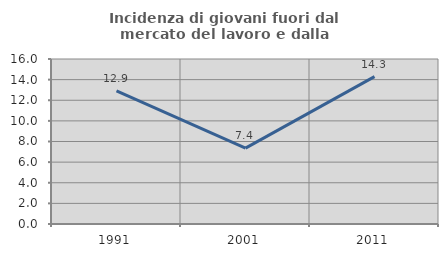
| Category | Incidenza di giovani fuori dal mercato del lavoro e dalla formazione  |
|---|---|
| 1991.0 | 12.903 |
| 2001.0 | 7.353 |
| 2011.0 | 14.286 |